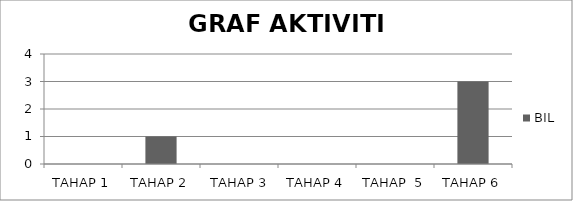
| Category | BIL |
|---|---|
| TAHAP 1 | 0 |
| TAHAP 2 | 1 |
|  TAHAP 3 | 0 |
| TAHAP 4 | 0 |
| TAHAP  5 | 0 |
| TAHAP 6 | 3 |